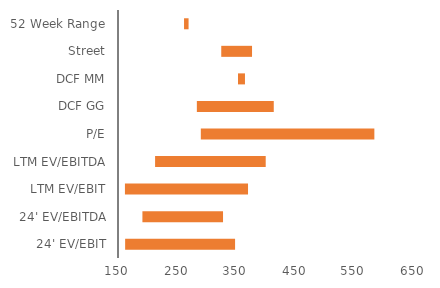
| Category | Series 0 | Series 1 |
|---|---|---|
| 24' EV/EBIT | 162.1 | 186.328 |
| 24' EV/EBITDA | 191.39 | 136.617 |
| LTM EV/EBIT | 161.763 | 208.616 |
| LTM EV/EBITDA | 212.863 | 187.496 |
| P/E | 290.37 | 294.136 |
| DCF GG | 283.647 | 130.36 |
| DCF MM | 353.382 | 11.824 |
| Street | 325 | 52.174 |
| 52 Week Range | 261.93 | 7.68 |